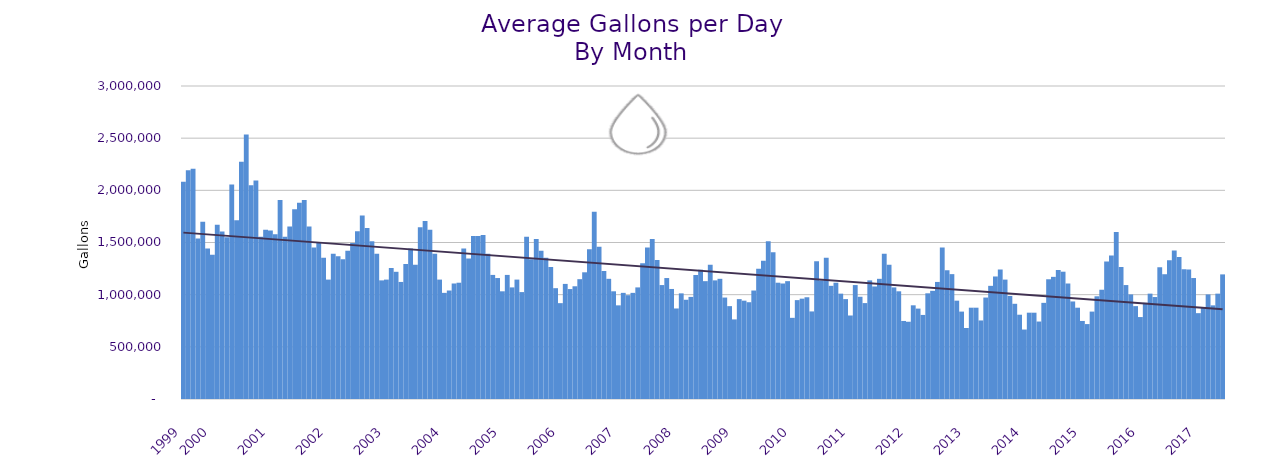
| Category | Series 0 |
|---|---|
| 1999.0 | 2083059.677 |
| nan | 2193643.161 |
| nan | 2206396.3 |
| nan | 1539362.581 |
| nan | 1699794.167 |
| nan | 1441848.323 |
| 2000.0 | 1381607.161 |
| nan | 1671325.214 |
| nan | 1605326.129 |
| nan | 1550398.467 |
| nan | 2055473.161 |
| nan | 1712920 |
| nan | 2273920 |
| nan | 2535720 |
| nan | 2049520 |
| nan | 2094400 |
| nan | 1555840 |
| nan | 1623160 |
| 2001.0 | 1615680 |
| nan | 1578280 |
| nan | 1907400 |
| nan | 1555840 |
| nan | 1653080 |
| nan | 1817640 |
| nan | 1880808.419 |
| nan | 1907400 |
| nan | 1653080 |
| nan | 1451120 |
| nan | 1503480 |
| nan | 1353880 |
| 2002.0 | 1144440 |
| nan | 1391280 |
| nan | 1368840 |
| nan | 1338920 |
| nan | 1421200 |
| nan | 1496000 |
| nan | 1608200 |
| nan | 1757800 |
| nan | 1638120 |
| nan | 1510960 |
| nan | 1391280 |
| nan | 1136960 |
| 2003.0 | 1144440 |
| nan | 1256640 |
| nan | 1219240 |
| nan | 1122000 |
| nan | 1294040 |
| nan | 1443640 |
| nan | 1286560 |
| nan | 1645600 |
| nan | 1705440 |
| nan | 1623160 |
| nan | 1391280 |
| nan | 1144440 |
| 2004.0 | 1017280 |
| nan | 1039720 |
| nan | 1107040 |
| nan | 1114520 |
| nan | 1443640 |
| nan | 1346400 |
| nan | 1563320 |
| nan | 1563320 |
| nan | 1570800 |
| nan | 1391280 |
| nan | 1189320 |
| nan | 1159400 |
| 2005.0 | 1032240 |
| nan | 1189320 |
| nan | 1069640 |
| nan | 1144440 |
| nan | 1024760 |
| nan | 1555840 |
| nan | 1338920 |
| nan | 1533400 |
| nan | 1421200 |
| nan | 1353880 |
| nan | 1264120 |
| nan | 1062160 |
| 2006.0 | 918712.194 |
| nan | 1103155.536 |
| nan | 1053757.452 |
| nan | 1080438.5 |
| nan | 1148463.71 |
| nan | 1214446 |
| nan | 1436160 |
| nan | 1795200 |
| nan | 1458600 |
| nan | 1226720 |
| nan | 1151920 |
| nan | 1032240 |
| 2007.0 | 897600 |
| nan | 1017280 |
| nan | 994840 |
| nan | 1017280 |
| nan | 1069640 |
| nan | 1301520 |
| nan | 1451120 |
| nan | 1533400 |
| nan | 1331440 |
| nan | 1092080 |
| nan | 1159400 |
| nan | 1054680 |
| 2008.0 | 867680 |
| nan | 1012531.5 |
| nan | 951152.129 |
| nan | 978536.8 |
| nan | 1188344.032 |
| nan | 1238728.733 |
| nan | 1129480 |
| nan | 1286560 |
| nan | 1136960 |
| nan | 1151920 |
| nan | 972400 |
| nan | 890120 |
| 2009.0 | 762960 |
| nan | 957440 |
| nan | 942480 |
| nan | 927520 |
| nan | 1039720 |
| nan | 1249160 |
| nan | 1323960 |
| nan | 1510960 |
| nan | 1406240 |
| nan | 1114520 |
| nan | 1107040 |
| nan | 1129480 |
| 2010.0 | 777920 |
| nan | 947745.25 |
| nan | 961719.161 |
| nan | 975173.833 |
| nan | 839375.806 |
| nan | 1320121.233 |
| nan | 1136960 |
| nan | 1353880 |
| nan | 1084600 |
| nan | 1114520 |
| nan | 1009800 |
| nan | 957440 |
| 2011.0 | 800360 |
| nan | 1092080 |
| nan | 979880 |
| nan | 919316.129 |
| nan | 1136960 |
| nan | 1078567.742 |
| nan | 1151920 |
| nan | 1391280 |
| nan | 1286560 |
| nan | 1069640 |
| nan | 1032240 |
| nan | 748000 |
| 2012.0 | 740520 |
| nan | 898004.612 |
| nan | 866524 |
| nan | 805719.677 |
| nan | 1012979 |
| nan | 1036854.677 |
| nan | 1122000 |
| nan | 1451120 |
| nan | 1234200 |
| nan | 1196800 |
| nan | 942480 |
| nan | 837760 |
| 2013.0 | 680680 |
| nan | 875160 |
| nan | 875160 |
| nan | 752825.806 |
| nan | 972400 |
| nan | 1084600 |
| nan | 1174360 |
| nan | 1241680 |
| nan | 1144440 |
| nan | 987360 |
| nan | 912560 |
| nan | 807840 |
| 2014.0 | 665720 |
| nan | 827341 |
| nan | 827106 |
| nan | 742463 |
| nan | 921589 |
| nan | 1147621 |
| nan | 1170725 |
| nan | 1236586 |
| nan | 1220152 |
| nan | 1107040 |
| nan | 935000 |
| nan | 875160 |
| 2015.0 | 748000 |
| nan | 718080 |
| nan | 837760 |
| nan | 984464.516 |
| nan | 1047200 |
| nan | 1317445.161 |
| nan | 1376320 |
| nan | 1600720 |
| nan | 1264120 |
| nan | 1092080 |
| nan | 1002320 |
| nan | 890120 |
| 2016.0 | 785400 |
| nan | 921910 |
| nan | 1009800 |
| nan | 977225.806 |
| nan | 1262547.196 |
| nan | 1195954.511 |
| nan | 1329445 |
| nan | 1422197 |
| nan | 1361360 |
| nan | 1244422 |
| nan | 1241680 |
| nan | 1159400 |
| 2017.0 | 822800 |
| nan | 878296.774 |
| nan | 1002320 |
| nan | 897600 |
| nan | 1009800 |
| nan | 1194387.097 |